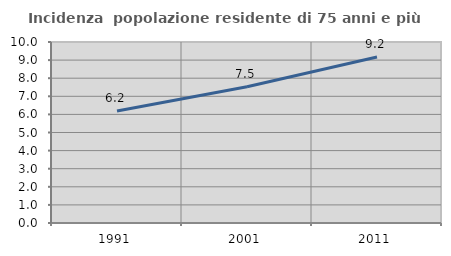
| Category | Incidenza  popolazione residente di 75 anni e più |
|---|---|
| 1991.0 | 6.187 |
| 2001.0 | 7.532 |
| 2011.0 | 9.168 |